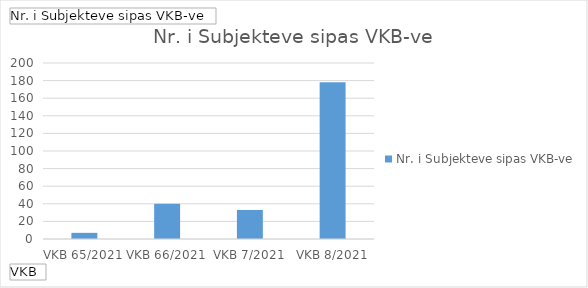
| Category | Totali |
|---|---|
| VKB 65/2021 | 7 |
| VKB 66/2021 | 40 |
| VKB 7/2021 | 33 |
| VKB 8/2021 | 178 |